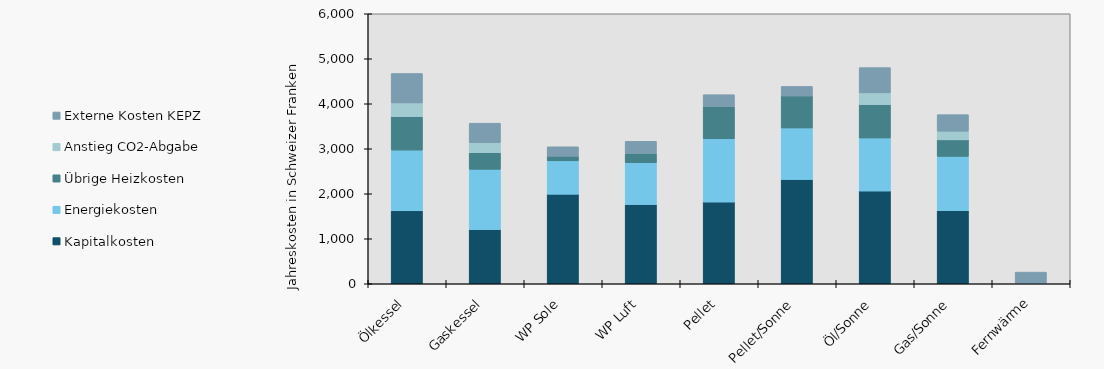
| Category | Kapitalkosten | Energiekosten | Übrige Heizkosten | Anstieg CO2-Abgabe | Externe Kosten KEPZ |
|---|---|---|---|---|---|
| Ölkessel | 1621.098 | 1348.795 | 746.182 | 302.242 | 654.543 |
| Gaskessel | 1201.28 | 1342.513 | 367 | 226.436 | 431.998 |
| WP Sole | 1989.776 | 742.762 | 100 | 0 | 211.764 |
| WP Luft | 1759.276 | 929.766 | 200 | 0 | 276.922 |
| Pellet | 1815.293 | 1406.156 | 717.017 | 0 | 263.414 |
| Pellet/Sonne | 2317.003 | 1145.925 | 711.613 | 0 | 210.731 |
| Öl/Sonne | 2061.078 | 1179.174 | 742.482 | 259.527 | 562.039 |
| Gas/Sonne | 1624.288 | 1207.136 | 367 | 192.471 | 367.199 |
| Fernwärme | 0 | 0 | 0 | 0 | 259.199 |